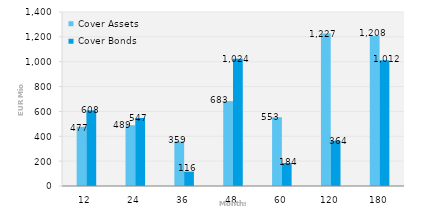
| Category | Cover Assets | Cover Bonds |
|---|---|---|
| 12.0 | 476.944 | 608.282 |
| 24.0 | 489.163 | 547.44 |
| 36.0 | 359.256 | 115.569 |
| 48.0 | 682.69 | 1024 |
| 60.0 | 553.13 | 184.274 |
| 120.0 | 1227.279 | 364.28 |
| 180.0 | 1208.203 | 1012.355 |